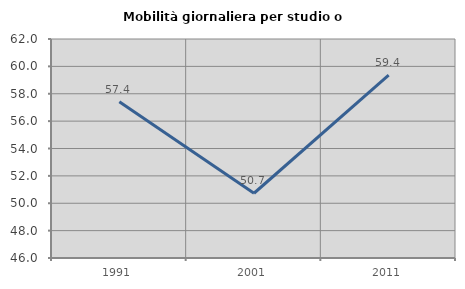
| Category | Mobilità giornaliera per studio o lavoro |
|---|---|
| 1991.0 | 57.407 |
| 2001.0 | 50.731 |
| 2011.0 | 59.353 |